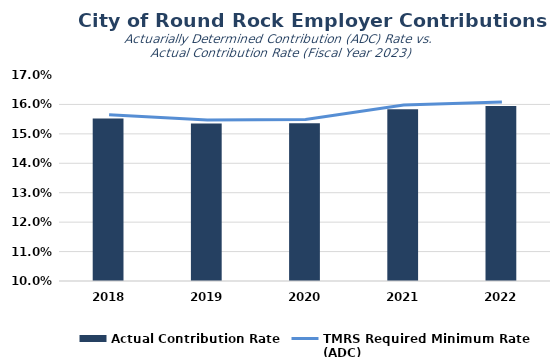
| Category | Actual Contribution Rate |
|---|---|
| 2018.0 | 0.155 |
| 2019.0 | 0.154 |
| 2020.0 | 0.154 |
| 2021.0 | 0.158 |
| 2022.0 | 0.159 |